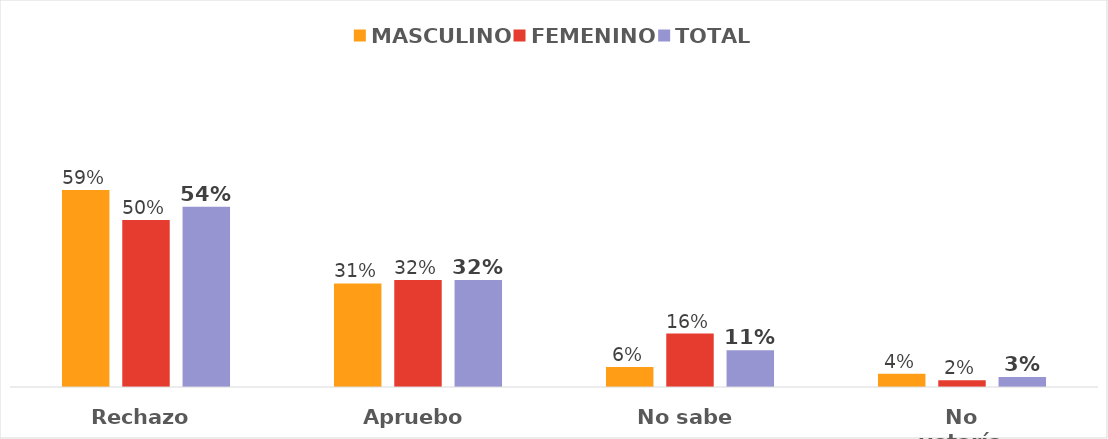
| Category | MASCULINO | FEMENINO | TOTAL |
|---|---|---|---|
| Rechazo | 0.59 | 0.5 | 0.54 |
| Apruebo | 0.31 | 0.32 | 0.32 |
| No sabe | 0.06 | 0.16 | 0.11 |
| No votaría | 0.04 | 0.02 | 0.03 |